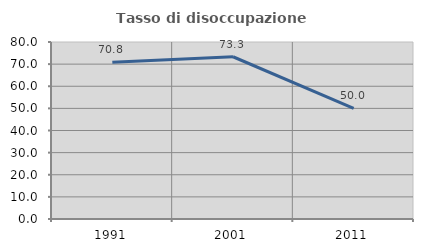
| Category | Tasso di disoccupazione giovanile  |
|---|---|
| 1991.0 | 70.833 |
| 2001.0 | 73.333 |
| 2011.0 | 50 |